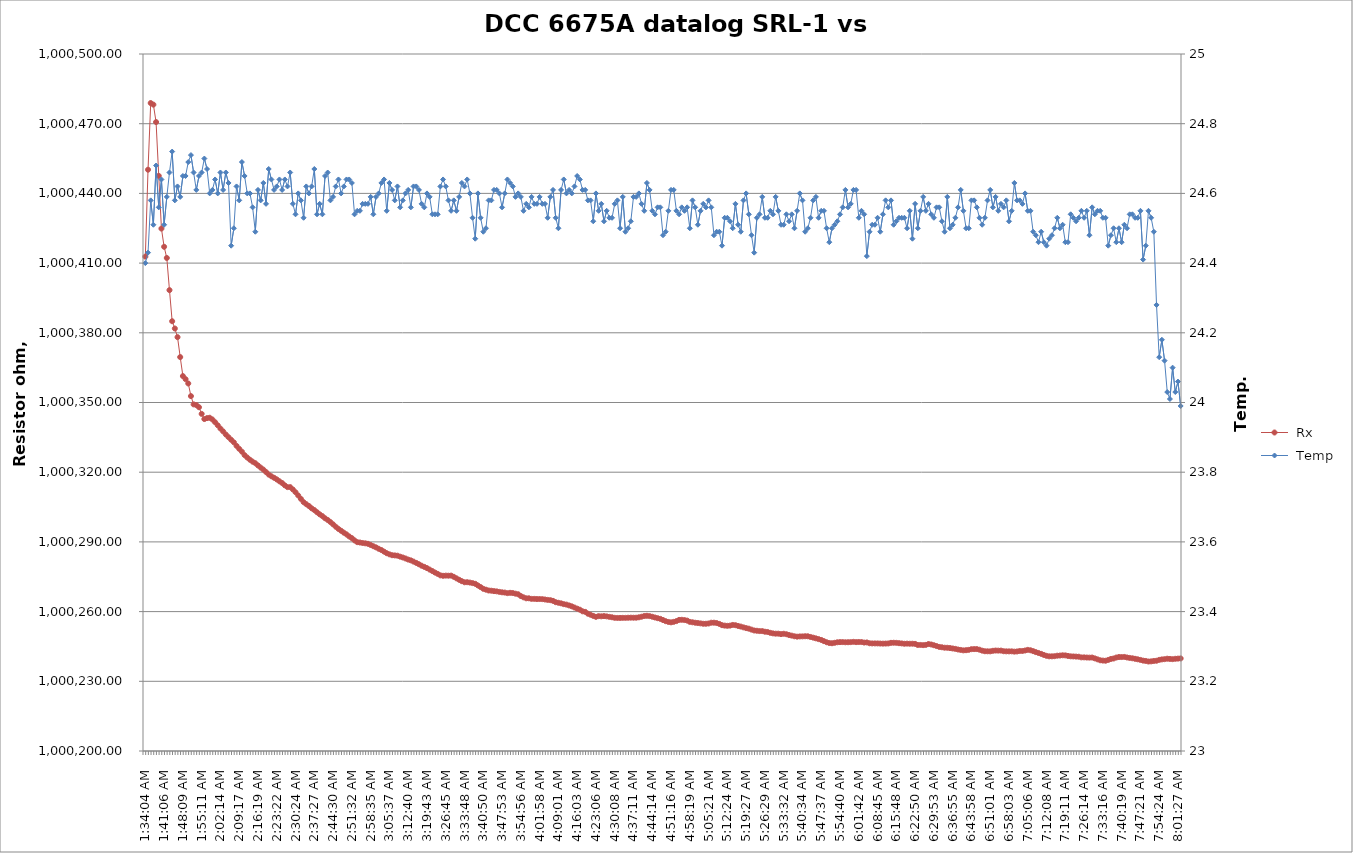
| Category |  Rx |
|---|---|
| 2021-03-08 01:34:04 | 1000412.79 |
| 2021-03-08 01:35:04 | 1000450.195 |
| 2021-03-08 01:36:04 | 1000478.888 |
| 2021-03-08 01:37:05 | 1000478.212 |
| 2021-03-08 01:38:05 | 1000470.707 |
| 2021-03-08 01:39:06 | 1000447.537 |
| 2021-03-08 01:40:06 | 1000424.858 |
| 2021-03-08 01:41:06 | 1000417.023 |
| 2021-03-08 01:42:07 | 1000412.213 |
| 2021-03-08 01:43:07 | 1000398.37 |
| 2021-03-08 01:44:07 | 1000384.987 |
| 2021-03-08 01:45:08 | 1000381.842 |
| 2021-03-08 01:46:08 | 1000378.129 |
| 2021-03-08 01:47:08 | 1000369.553 |
| 2021-03-08 01:48:09 | 1000361.375 |
| 2021-03-08 01:49:09 | 1000360.045 |
| 2021-03-08 01:50:10 | 1000358.187 |
| 2021-03-08 01:51:10 | 1000352.757 |
| 2021-03-08 01:52:10 | 1000349.189 |
| 2021-03-08 01:53:11 | 1000348.892 |
| 2021-03-08 01:54:11 | 1000347.967 |
| 2021-03-08 01:55:11 | 1000345.099 |
| 2021-03-08 01:56:12 | 1000342.883 |
| 2021-03-08 01:57:12 | 1000343.274 |
| 2021-03-08 01:58:13 | 1000343.436 |
| 2021-03-08 01:59:13 | 1000342.687 |
| 2021-03-08 02:00:13 | 1000341.514 |
| 2021-03-08 02:01:14 | 1000340.193 |
| 2021-03-08 02:02:14 | 1000338.786 |
| 2021-03-08 02:03:14 | 1000337.563 |
| 2021-03-08 02:04:15 | 1000336.235 |
| 2021-03-08 02:05:15 | 1000335.072 |
| 2021-03-08 02:06:16 | 1000333.949 |
| 2021-03-08 02:07:16 | 1000332.857 |
| 2021-03-08 02:08:16 | 1000331.347 |
| 2021-03-08 02:09:17 | 1000330.04 |
| 2021-03-08 02:10:17 | 1000328.828 |
| 2021-03-08 02:11:17 | 1000327.354 |
| 2021-03-08 02:12:18 | 1000326.302 |
| 2021-03-08 02:13:18 | 1000325.356 |
| 2021-03-08 02:14:19 | 1000324.531 |
| 2021-03-08 02:15:19 | 1000323.868 |
| 2021-03-08 02:16:19 | 1000322.908 |
| 2021-03-08 02:17:20 | 1000321.976 |
| 2021-03-08 02:18:20 | 1000321.112 |
| 2021-03-08 02:19:20 | 1000320.066 |
| 2021-03-08 02:20:21 | 1000318.986 |
| 2021-03-08 02:21:21 | 1000318.241 |
| 2021-03-08 02:22:21 | 1000317.595 |
| 2021-03-08 02:23:22 | 1000316.898 |
| 2021-03-08 02:24:22 | 1000316.082 |
| 2021-03-08 02:25:23 | 1000315.338 |
| 2021-03-08 02:26:23 | 1000314.353 |
| 2021-03-08 02:27:23 | 1000313.578 |
| 2021-03-08 02:28:24 | 1000313.578 |
| 2021-03-08 02:29:24 | 1000312.574 |
| 2021-03-08 02:30:24 | 1000311.368 |
| 2021-03-08 02:31:25 | 1000309.982 |
| 2021-03-08 02:32:25 | 1000308.516 |
| 2021-03-08 02:33:26 | 1000307.117 |
| 2021-03-08 02:34:26 | 1000306.226 |
| 2021-03-08 02:35:26 | 1000305.45 |
| 2021-03-08 02:36:27 | 1000304.464 |
| 2021-03-08 02:37:27 | 1000303.698 |
| 2021-03-08 02:38:27 | 1000302.77 |
| 2021-03-08 02:39:28 | 1000301.878 |
| 2021-03-08 02:40:28 | 1000301.097 |
| 2021-03-08 02:41:28 | 1000300.169 |
| 2021-03-08 02:42:29 | 1000299.441 |
| 2021-03-08 02:43:29 | 1000298.526 |
| 2021-03-08 02:44:30 | 1000297.553 |
| 2021-03-08 02:45:30 | 1000296.519 |
| 2021-03-08 02:46:30 | 1000295.576 |
| 2021-03-08 02:47:31 | 1000294.776 |
| 2021-03-08 02:48:31 | 1000293.978 |
| 2021-03-08 02:49:31 | 1000293.232 |
| 2021-03-08 02:50:32 | 1000292.351 |
| 2021-03-08 02:51:32 | 1000291.63 |
| 2021-03-08 02:52:33 | 1000290.65 |
| 2021-03-08 02:53:33 | 1000289.891 |
| 2021-03-08 02:54:33 | 1000289.733 |
| 2021-03-08 02:55:34 | 1000289.532 |
| 2021-03-08 02:56:34 | 1000289.391 |
| 2021-03-08 02:57:34 | 1000289.18 |
| 2021-03-08 02:58:35 | 1000288.693 |
| 2021-03-08 02:59:35 | 1000288.14 |
| 2021-03-08 03:00:36 | 1000287.649 |
| 2021-03-08 03:01:36 | 1000287.042 |
| 2021-03-08 03:02:36 | 1000286.505 |
| 2021-03-08 03:03:37 | 1000285.804 |
| 2021-03-08 03:04:37 | 1000285.134 |
| 2021-03-08 03:05:37 | 1000284.645 |
| 2021-03-08 03:06:38 | 1000284.268 |
| 2021-03-08 03:07:38 | 1000284.18 |
| 2021-03-08 03:08:39 | 1000284.065 |
| 2021-03-08 03:09:39 | 1000283.643 |
| 2021-03-08 03:10:39 | 1000283.288 |
| 2021-03-08 03:11:40 | 1000282.862 |
| 2021-03-08 03:12:40 | 1000282.396 |
| 2021-03-08 03:13:40 | 1000282.05 |
| 2021-03-08 03:14:41 | 1000281.514 |
| 2021-03-08 03:15:41 | 1000280.958 |
| 2021-03-08 03:16:41 | 1000280.382 |
| 2021-03-08 03:17:42 | 1000279.757 |
| 2021-03-08 03:18:42 | 1000279.248 |
| 2021-03-08 03:19:43 | 1000278.719 |
| 2021-03-08 03:20:43 | 1000278.081 |
| 2021-03-08 03:21:43 | 1000277.447 |
| 2021-03-08 03:22:44 | 1000276.804 |
| 2021-03-08 03:23:44 | 1000276.241 |
| 2021-03-08 03:24:45 | 1000275.59 |
| 2021-03-08 03:25:45 | 1000275.414 |
| 2021-03-08 03:26:45 | 1000275.483 |
| 2021-03-08 03:27:46 | 1000275.448 |
| 2021-03-08 03:28:46 | 1000275.487 |
| 2021-03-08 03:29:46 | 1000274.976 |
| 2021-03-08 03:30:47 | 1000274.309 |
| 2021-03-08 03:31:47 | 1000273.69 |
| 2021-03-08 03:32:47 | 1000273.095 |
| 2021-03-08 03:33:48 | 1000272.625 |
| 2021-03-08 03:34:48 | 1000272.653 |
| 2021-03-08 03:35:49 | 1000272.488 |
| 2021-03-08 03:36:49 | 1000272.269 |
| 2021-03-08 03:37:49 | 1000271.96 |
| 2021-03-08 03:38:50 | 1000271.251 |
| 2021-03-08 03:39:50 | 1000270.554 |
| 2021-03-08 03:40:50 | 1000269.808 |
| 2021-03-08 03:41:51 | 1000269.436 |
| 2021-03-08 03:42:51 | 1000269.079 |
| 2021-03-08 03:43:52 | 1000268.989 |
| 2021-03-08 03:44:52 | 1000268.812 |
| 2021-03-08 03:45:52 | 1000268.707 |
| 2021-03-08 03:46:53 | 1000268.483 |
| 2021-03-08 03:47:53 | 1000268.301 |
| 2021-03-08 03:48:53 | 1000268.189 |
| 2021-03-08 03:49:54 | 1000267.946 |
| 2021-03-08 03:50:54 | 1000268.086 |
| 2021-03-08 03:51:55 | 1000267.994 |
| 2021-03-08 03:52:55 | 1000267.716 |
| 2021-03-08 03:53:55 | 1000267.467 |
| 2021-03-08 03:54:56 | 1000266.696 |
| 2021-03-08 03:55:56 | 1000266.136 |
| 2021-03-08 03:56:56 | 1000265.725 |
| 2021-03-08 03:57:57 | 1000265.725 |
| 2021-03-08 03:58:57 | 1000265.476 |
| 2021-03-08 03:59:57 | 1000265.476 |
| 2021-03-08 04:00:58 | 1000265.404 |
| 2021-03-08 04:01:58 | 1000265.412 |
| 2021-03-08 04:02:59 | 1000265.366 |
| 2021-03-08 04:03:59 | 1000265.209 |
| 2021-03-08 04:04:59 | 1000265.038 |
| 2021-03-08 04:06:00 | 1000264.917 |
| 2021-03-08 04:07:00 | 1000264.625 |
| 2021-03-08 04:08:00 | 1000264.045 |
| 2021-03-08 04:09:01 | 1000263.802 |
| 2021-03-08 04:10:01 | 1000263.559 |
| 2021-03-08 04:11:02 | 1000263.209 |
| 2021-03-08 04:12:02 | 1000263.013 |
| 2021-03-08 04:13:02 | 1000262.651 |
| 2021-03-08 04:14:03 | 1000262.266 |
| 2021-03-08 04:15:03 | 1000261.753 |
| 2021-03-08 04:16:03 | 1000261.278 |
| 2021-03-08 04:17:04 | 1000260.826 |
| 2021-03-08 04:18:04 | 1000260.118 |
| 2021-03-08 04:19:04 | 1000259.879 |
| 2021-03-08 04:20:05 | 1000259.086 |
| 2021-03-08 04:21:05 | 1000258.647 |
| 2021-03-08 04:22:06 | 1000258.139 |
| 2021-03-08 04:23:06 | 1000257.746 |
| 2021-03-08 04:24:06 | 1000258.043 |
| 2021-03-08 04:25:07 | 1000257.975 |
| 2021-03-08 04:26:07 | 1000258.067 |
| 2021-03-08 04:27:07 | 1000257.944 |
| 2021-03-08 04:28:08 | 1000257.741 |
| 2021-03-08 04:29:08 | 1000257.553 |
| 2021-03-08 04:30:08 | 1000257.323 |
| 2021-03-08 04:31:09 | 1000257.266 |
| 2021-03-08 04:32:09 | 1000257.274 |
| 2021-03-08 04:33:10 | 1000257.309 |
| 2021-03-08 04:34:10 | 1000257.301 |
| 2021-03-08 04:35:10 | 1000257.357 |
| 2021-03-08 04:36:11 | 1000257.386 |
| 2021-03-08 04:37:11 | 1000257.364 |
| 2021-03-08 04:38:11 | 1000257.372 |
| 2021-03-08 04:39:12 | 1000257.543 |
| 2021-03-08 04:40:12 | 1000257.797 |
| 2021-03-08 04:41:13 | 1000258.101 |
| 2021-03-08 04:42:13 | 1000258.196 |
| 2021-03-08 04:43:13 | 1000258.072 |
| 2021-03-08 04:44:14 | 1000257.784 |
| 2021-03-08 04:45:14 | 1000257.462 |
| 2021-03-08 04:46:14 | 1000257.164 |
| 2021-03-08 04:47:15 | 1000256.873 |
| 2021-03-08 04:48:15 | 1000256.377 |
| 2021-03-08 04:49:15 | 1000255.877 |
| 2021-03-08 04:50:16 | 1000255.542 |
| 2021-03-08 04:51:16 | 1000255.383 |
| 2021-03-08 04:52:17 | 1000255.589 |
| 2021-03-08 04:53:17 | 1000255.91 |
| 2021-03-08 04:54:17 | 1000256.428 |
| 2021-03-08 04:55:18 | 1000256.471 |
| 2021-03-08 04:56:18 | 1000256.361 |
| 2021-03-08 04:57:18 | 1000256.13 |
| 2021-03-08 04:58:19 | 1000255.576 |
| 2021-03-08 04:59:19 | 1000255.399 |
| 2021-03-08 05:00:20 | 1000255.21 |
| 2021-03-08 05:01:20 | 1000255.084 |
| 2021-03-08 05:02:20 | 1000254.932 |
| 2021-03-08 05:03:21 | 1000254.77 |
| 2021-03-08 05:04:21 | 1000254.771 |
| 2021-03-08 05:05:21 | 1000254.883 |
| 2021-03-08 05:06:22 | 1000255.215 |
| 2021-03-08 05:07:22 | 1000255.222 |
| 2021-03-08 05:08:23 | 1000255.086 |
| 2021-03-08 05:09:23 | 1000254.703 |
| 2021-03-08 05:10:23 | 1000254.156 |
| 2021-03-08 05:11:24 | 1000253.97 |
| 2021-03-08 05:12:24 | 1000253.876 |
| 2021-03-08 05:13:24 | 1000253.975 |
| 2021-03-08 05:14:25 | 1000254.255 |
| 2021-03-08 05:15:25 | 1000254.149 |
| 2021-03-08 05:16:26 | 1000253.82 |
| 2021-03-08 05:17:26 | 1000253.558 |
| 2021-03-08 05:18:26 | 1000253.211 |
| 2021-03-08 05:19:27 | 1000252.895 |
| 2021-03-08 05:20:27 | 1000252.654 |
| 2021-03-08 05:21:27 | 1000252.246 |
| 2021-03-08 05:22:28 | 1000251.874 |
| 2021-03-08 05:23:28 | 1000251.75 |
| 2021-03-08 05:24:28 | 1000251.618 |
| 2021-03-08 05:25:29 | 1000251.609 |
| 2021-03-08 05:26:29 | 1000251.338 |
| 2021-03-08 05:27:30 | 1000251.227 |
| 2021-03-08 05:28:30 | 1000250.864 |
| 2021-03-08 05:29:30 | 1000250.627 |
| 2021-03-08 05:30:31 | 1000250.496 |
| 2021-03-08 05:31:31 | 1000250.496 |
| 2021-03-08 05:32:31 | 1000250.311 |
| 2021-03-08 05:33:32 | 1000250.456 |
| 2021-03-08 05:34:32 | 1000250.261 |
| 2021-03-08 05:35:33 | 1000249.907 |
| 2021-03-08 05:36:33 | 1000249.656 |
| 2021-03-08 05:37:33 | 1000249.373 |
| 2021-03-08 05:38:34 | 1000249.211 |
| 2021-03-08 05:39:34 | 1000249.314 |
| 2021-03-08 05:40:34 | 1000249.343 |
| 2021-03-08 05:41:35 | 1000249.391 |
| 2021-03-08 05:42:35 | 1000249.376 |
| 2021-03-08 05:43:36 | 1000249.084 |
| 2021-03-08 05:44:36 | 1000248.789 |
| 2021-03-08 05:45:36 | 1000248.485 |
| 2021-03-08 05:46:37 | 1000248.159 |
| 2021-03-08 05:47:37 | 1000247.8 |
| 2021-03-08 05:48:37 | 1000247.288 |
| 2021-03-08 05:49:38 | 1000246.812 |
| 2021-03-08 05:50:38 | 1000246.474 |
| 2021-03-08 05:51:39 | 1000246.381 |
| 2021-03-08 05:52:39 | 1000246.571 |
| 2021-03-08 05:53:39 | 1000246.795 |
| 2021-03-08 05:54:40 | 1000246.867 |
| 2021-03-08 05:55:40 | 1000246.877 |
| 2021-03-08 05:56:40 | 1000246.801 |
| 2021-03-08 05:57:41 | 1000246.82 |
| 2021-03-08 05:58:41 | 1000246.86 |
| 2021-03-08 05:59:42 | 1000246.983 |
| 2021-03-08 06:00:42 | 1000246.862 |
| 2021-03-08 06:01:42 | 1000246.909 |
| 2021-03-08 06:02:43 | 1000246.896 |
| 2021-03-08 06:03:43 | 1000246.677 |
| 2021-03-08 06:04:43 | 1000246.722 |
| 2021-03-08 06:05:44 | 1000246.374 |
| 2021-03-08 06:06:44 | 1000246.308 |
| 2021-03-08 06:07:45 | 1000246.305 |
| 2021-03-08 06:08:45 | 1000246.303 |
| 2021-03-08 06:09:45 | 1000246.248 |
| 2021-03-08 06:10:46 | 1000246.212 |
| 2021-03-08 06:11:46 | 1000246.238 |
| 2021-03-08 06:12:46 | 1000246.291 |
| 2021-03-08 06:13:47 | 1000246.554 |
| 2021-03-08 06:14:47 | 1000246.589 |
| 2021-03-08 06:15:48 | 1000246.548 |
| 2021-03-08 06:16:48 | 1000246.402 |
| 2021-03-08 06:17:48 | 1000246.3 |
| 2021-03-08 06:18:49 | 1000246.158 |
| 2021-03-08 06:19:49 | 1000246.213 |
| 2021-03-08 06:20:49 | 1000246.162 |
| 2021-03-08 06:21:50 | 1000246.174 |
| 2021-03-08 06:22:50 | 1000246.099 |
| 2021-03-08 06:23:51 | 1000245.638 |
| 2021-03-08 06:24:51 | 1000245.648 |
| 2021-03-08 06:25:51 | 1000245.564 |
| 2021-03-08 06:26:52 | 1000245.675 |
| 2021-03-08 06:27:52 | 1000246.04 |
| 2021-03-08 06:28:52 | 1000245.845 |
| 2021-03-08 06:29:53 | 1000245.524 |
| 2021-03-08 06:30:53 | 1000245.171 |
| 2021-03-08 06:31:54 | 1000244.79 |
| 2021-03-08 06:32:54 | 1000244.643 |
| 2021-03-08 06:33:54 | 1000244.455 |
| 2021-03-08 06:34:55 | 1000244.43 |
| 2021-03-08 06:35:55 | 1000244.306 |
| 2021-03-08 06:36:55 | 1000244.125 |
| 2021-03-08 06:37:56 | 1000243.958 |
| 2021-03-08 06:38:56 | 1000243.686 |
| 2021-03-08 06:39:56 | 1000243.502 |
| 2021-03-08 06:40:57 | 1000243.316 |
| 2021-03-08 06:41:57 | 1000243.393 |
| 2021-03-08 06:42:58 | 1000243.53 |
| 2021-03-08 06:43:58 | 1000243.828 |
| 2021-03-08 06:44:58 | 1000243.86 |
| 2021-03-08 06:45:59 | 1000243.866 |
| 2021-03-08 06:46:59 | 1000243.601 |
| 2021-03-08 06:47:59 | 1000243.187 |
| 2021-03-08 06:49:00 | 1000242.938 |
| 2021-03-08 06:50:00 | 1000242.915 |
| 2021-03-08 06:51:01 | 1000242.899 |
| 2021-03-08 06:52:01 | 1000243.128 |
| 2021-03-08 06:53:01 | 1000243.231 |
| 2021-03-08 06:54:02 | 1000243.2 |
| 2021-03-08 06:55:02 | 1000243.213 |
| 2021-03-08 06:56:02 | 1000242.947 |
| 2021-03-08 06:57:03 | 1000242.898 |
| 2021-03-08 06:58:03 | 1000242.883 |
| 2021-03-08 06:59:04 | 1000242.897 |
| 2021-03-08 07:00:04 | 1000242.77 |
| 2021-03-08 07:01:04 | 1000242.844 |
| 2021-03-08 07:02:05 | 1000243.048 |
| 2021-03-08 07:03:05 | 1000243.048 |
| 2021-03-08 07:04:05 | 1000243.256 |
| 2021-03-08 07:05:06 | 1000243.527 |
| 2021-03-08 07:06:06 | 1000243.356 |
| 2021-03-08 07:07:07 | 1000242.975 |
| 2021-03-08 07:08:07 | 1000242.56 |
| 2021-03-08 07:09:07 | 1000242.197 |
| 2021-03-08 07:10:08 | 1000241.807 |
| 2021-03-08 07:11:08 | 1000241.348 |
| 2021-03-08 07:12:08 | 1000240.959 |
| 2021-03-08 07:13:09 | 1000240.747 |
| 2021-03-08 07:14:09 | 1000240.751 |
| 2021-03-08 07:15:09 | 1000240.815 |
| 2021-03-08 07:16:10 | 1000241.018 |
| 2021-03-08 07:17:10 | 1000241.089 |
| 2021-03-08 07:18:11 | 1000241.193 |
| 2021-03-08 07:19:11 | 1000241.155 |
| 2021-03-08 07:20:11 | 1000240.91 |
| 2021-03-08 07:21:12 | 1000240.748 |
| 2021-03-08 07:22:12 | 1000240.698 |
| 2021-03-08 07:23:12 | 1000240.632 |
| 2021-03-08 07:24:13 | 1000240.574 |
| 2021-03-08 07:25:13 | 1000240.299 |
| 2021-03-08 07:26:14 | 1000240.304 |
| 2021-03-08 07:27:14 | 1000240.227 |
| 2021-03-08 07:28:14 | 1000240.188 |
| 2021-03-08 07:29:15 | 1000240.225 |
| 2021-03-08 07:30:15 | 1000239.862 |
| 2021-03-08 07:31:15 | 1000239.448 |
| 2021-03-08 07:32:16 | 1000239.05 |
| 2021-03-08 07:33:16 | 1000238.917 |
| 2021-03-08 07:34:17 | 1000238.852 |
| 2021-03-08 07:35:17 | 1000239.207 |
| 2021-03-08 07:36:17 | 1000239.618 |
| 2021-03-08 07:37:18 | 1000239.81 |
| 2021-03-08 07:38:18 | 1000240.23 |
| 2021-03-08 07:39:18 | 1000240.452 |
| 2021-03-08 07:40:19 | 1000240.434 |
| 2021-03-08 07:41:19 | 1000240.487 |
| 2021-03-08 07:42:19 | 1000240.251 |
| 2021-03-08 07:43:20 | 1000240.057 |
| 2021-03-08 07:44:20 | 1000239.905 |
| 2021-03-08 07:45:21 | 1000239.683 |
| 2021-03-08 07:46:21 | 1000239.468 |
| 2021-03-08 07:47:21 | 1000239.204 |
| 2021-03-08 07:48:22 | 1000238.901 |
| 2021-03-08 07:49:22 | 1000238.759 |
| 2021-03-08 07:50:22 | 1000238.52 |
| 2021-03-08 07:51:23 | 1000238.583 |
| 2021-03-08 07:52:23 | 1000238.757 |
| 2021-03-08 07:53:24 | 1000238.851 |
| 2021-03-08 07:54:24 | 1000239.222 |
| 2021-03-08 07:55:24 | 1000239.428 |
| 2021-03-08 07:56:25 | 1000239.536 |
| 2021-03-08 07:57:25 | 1000239.722 |
| 2021-03-08 07:58:25 | 1000239.626 |
| 2021-03-08 07:59:26 | 1000239.532 |
| 2021-03-08 08:00:26 | 1000239.683 |
| 2021-03-08 08:01:27 | 1000239.764 |
| 2021-03-08 08:02:27 | 1000239.843 |